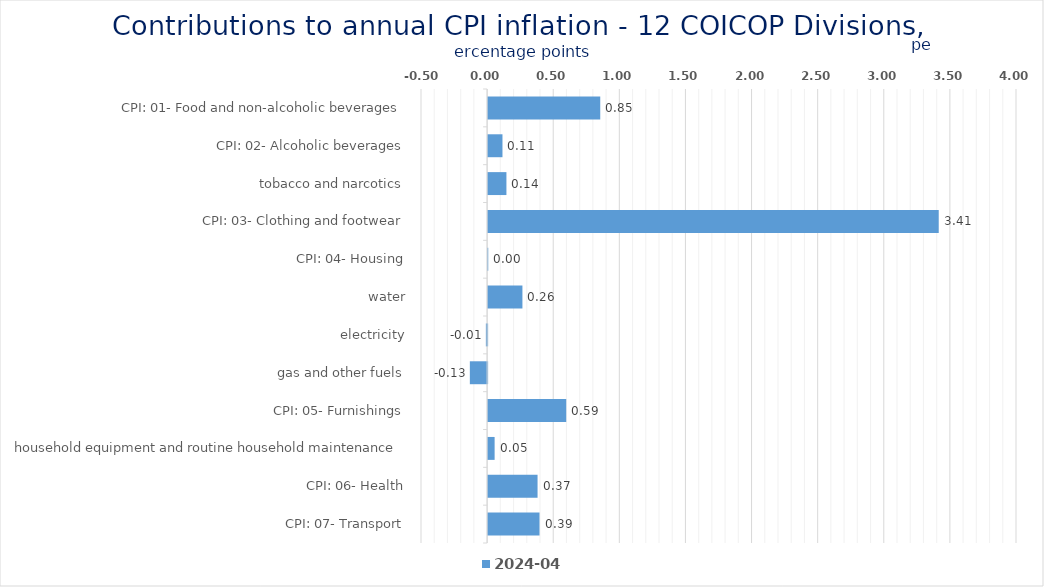
| Category | 2024-04 |
|---|---|
| CPI: 01- Food and non-alcoholic beverages | 0.848 |
| CPI: 02- Alcoholic beverages, tobacco and narcotics | 0.109 |
| CPI: 03- Clothing and footwear | 0.139 |
| CPI: 04- Housing, water, electricity, gas and other fuels | 3.408 |
| CPI: 05- Furnishings, household equipment and routine household maintenance | 0.001 |
| CPI: 06- Health | 0.26 |
| CPI: 07- Transport | -0.009 |
| CPI: 08- Communication | -0.131 |
| CPI: 09- Recreation and culture | 0.591 |
| CPI: 10- Education | 0.049 |
| CPI: 11- Restaurants and hotels | 0.374 |
| CPI: 12- Miscellaneous goods and services | 0.389 |